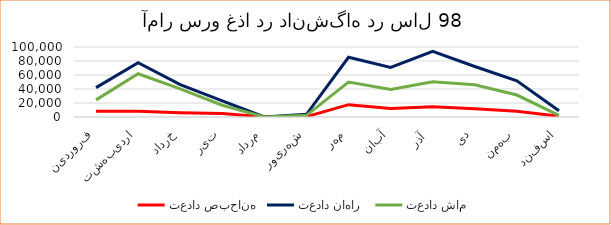
| Category | تعداد صبحانه | تعداد ناهار  | تعداد شام |
|---|---|---|---|
| فروردین | 8237 | 42013 | 24442 |
| اردیبهشت | 8274 | 77625 | 61832 |
| خرداد | 6101 | 46246 | 40095 |
| تیر | 5166 | 23166 | 16799 |
| مرداد | 0 | 0 | 0 |
|  شهریور | 464 | 3764 | 2337 |
| مهر | 17626 | 85267 | 49938 |
| آبان | 12044 | 70902 | 39263 |
| آذر  | 14797 | 93791 | 50406 |
| دی | 11687 | 72181 | 46106 |
| بهمن | 8063 | 51811 | 31371 |
| اسفند | 1151 | 9017 | 2292 |